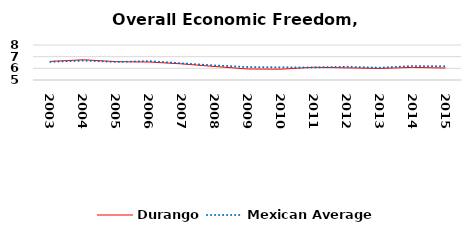
| Category | Durango | Mexican Average  |
|---|---|---|
| 2003.0 | 6.599 | 6.552 |
| 2004.0 | 6.731 | 6.668 |
| 2005.0 | 6.574 | 6.546 |
| 2006.0 | 6.539 | 6.619 |
| 2007.0 | 6.382 | 6.428 |
| 2008.0 | 6.154 | 6.248 |
| 2009.0 | 5.944 | 6.106 |
| 2010.0 | 5.928 | 6.086 |
| 2011.0 | 6.093 | 6.074 |
| 2012.0 | 6.041 | 6.134 |
| 2013.0 | 5.99 | 6.054 |
| 2014.0 | 6.081 | 6.2 |
| 2015.0 | 6.026 | 6.174 |